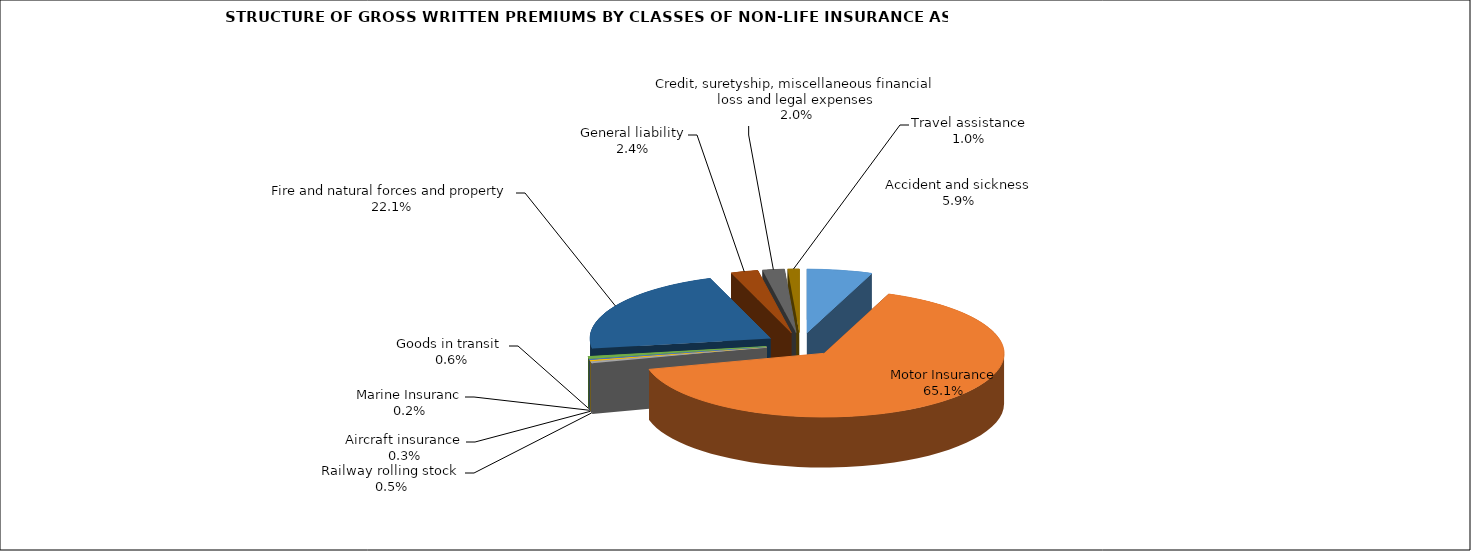
| Category | Accident and sickness |
|---|---|
| Accident and sickness | 0.059 |
| Motor Insurance | 0.651 |
| Railway rolling stock  | 0.005 |
| Aircraft insurance | 0.003 |
| Marine Insuranc | 0.002 |
| Goods in transit  | 0.006 |
| Fire and natural forces and property | 0.221 |
| General liability | 0.024 |
| Credit, suretyship, miscellaneous financial loss and legal expenses | 0.02 |
| Travel assistance | 0.01 |